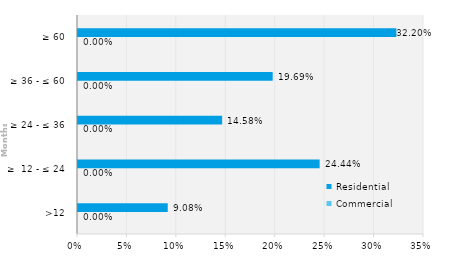
| Category | Commercial | Residential |
|---|---|---|
| >12 | 0 | 0.091 |
| ≥  12 - ≤ 24 | 0 | 0.244 |
| ≥ 24 - ≤ 36 | 0 | 0.146 |
| ≥ 36 - ≤ 60 | 0 | 0.197 |
| ≥ 60 | 0 | 0.322 |